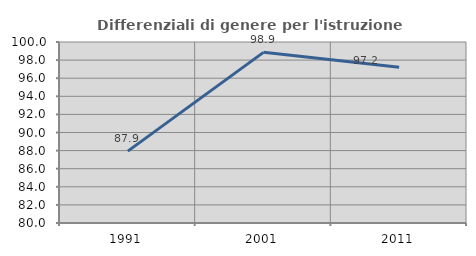
| Category | Differenziali di genere per l'istruzione superiore |
|---|---|
| 1991.0 | 87.941 |
| 2001.0 | 98.855 |
| 2011.0 | 97.212 |